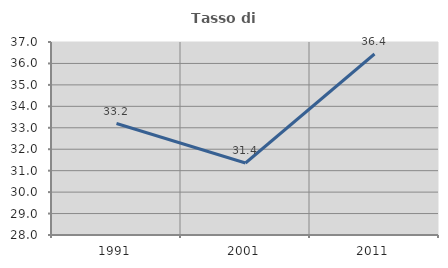
| Category | Tasso di occupazione   |
|---|---|
| 1991.0 | 33.199 |
| 2001.0 | 31.357 |
| 2011.0 | 36.44 |